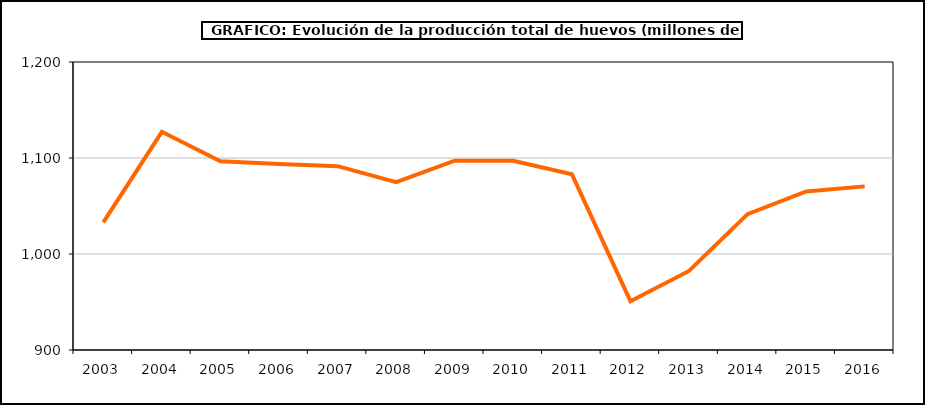
| Category | huevos |
|---|---|
| 2003.0 | 1033 |
| 2004.0 | 1127.271 |
| 2005.0 | 1096.54 |
| 2006.0 | 1093.721 |
| 2007.0 | 1091.465 |
| 2008.0 | 1074.834 |
| 2009.0 | 1097.178 |
| 2010.0 | 1097.2 |
| 2011.0 | 1083.082 |
| 2012.0 | 950.879 |
| 2013.0 | 982.375 |
| 2014.0 | 1041.522 |
| 2015.0 | 1065.202 |
| 2016.0 | 1070.45 |